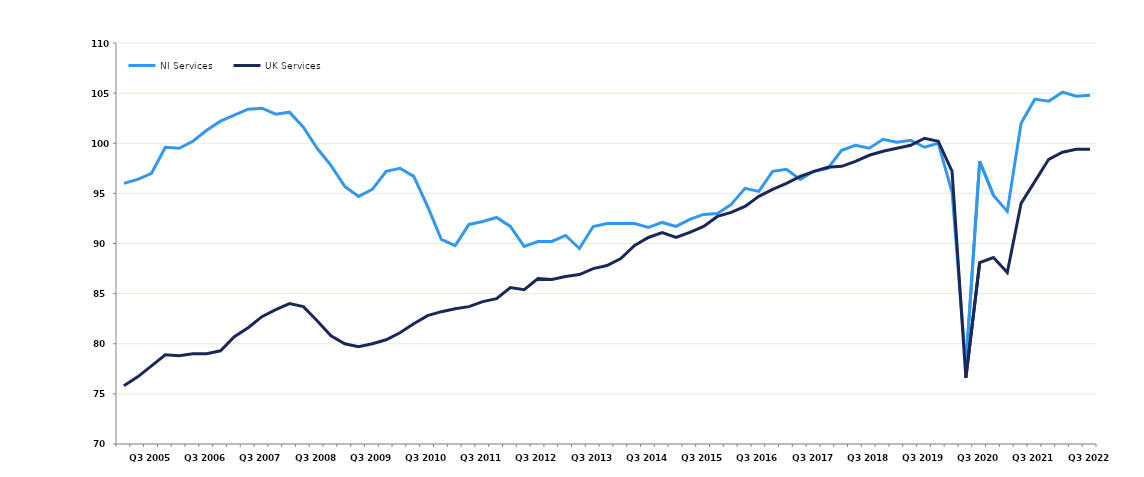
| Category | NI Services | UK Services |
|---|---|---|
|  | 96 | 75.8 |
|  | 96.4 | 76.7 |
| Q3 2005 | 97 | 77.8 |
|  | 99.6 | 78.9 |
|  | 99.5 | 78.8 |
|  | 100.2 | 79 |
| Q3 2006 | 101.3 | 79 |
|  | 102.2 | 79.3 |
|  | 102.8 | 80.7 |
|  | 103.4 | 81.6 |
| Q3 2007 | 103.5 | 82.7 |
|  | 102.9 | 83.4 |
|  | 103.1 | 84 |
|  | 101.6 | 83.7 |
| Q3 2008 | 99.5 | 82.3 |
|  | 97.8 | 80.8 |
|  | 95.7 | 80 |
|  | 94.7 | 79.7 |
| Q3 2009 | 95.4 | 80 |
|  | 97.2 | 80.4 |
|  | 97.5 | 81.1 |
|  | 96.7 | 82 |
| Q3 2010 | 93.7 | 82.8 |
|  | 90.4 | 83.2 |
|  | 89.8 | 83.5 |
|  | 91.9 | 83.7 |
| Q3 2011 | 92.2 | 84.2 |
|  | 92.6 | 84.5 |
|  | 91.7 | 85.6 |
|  | 89.7 | 85.4 |
| Q3 2012 | 90.2 | 86.5 |
|  | 90.2 | 86.4 |
|  | 90.8 | 86.7 |
|  | 89.5 | 86.9 |
| Q3 2013 | 91.7 | 87.5 |
|  | 92 | 87.8 |
|  | 92 | 88.5 |
|  | 92 | 89.8 |
| Q3 2014 | 91.6 | 90.6 |
|  | 92.1 | 91.1 |
|  | 91.7 | 90.6 |
|  | 92.4 | 91.1 |
| Q3 2015 | 92.9 | 91.7 |
|  | 93 | 92.7 |
|  | 93.9 | 93.1 |
|  | 95.5 | 93.7 |
| Q3 2016 | 95.2 | 94.7 |
|  | 97.2 | 95.4 |
|  | 97.4 | 96 |
|  | 96.4 | 96.7 |
| Q3 2017 | 97.2 | 97.2 |
|  | 97.5 | 97.6 |
|  | 99.3 | 97.7 |
|  | 99.8 | 98.2 |
| Q3 2018 | 99.5 | 98.8 |
|  | 100.4 | 99.2 |
|  | 100.1 | 99.5 |
|  | 100.3 | 99.8 |
| Q3 2019 | 99.6 | 100.5 |
|  | 100 | 100.2 |
|  | 95.1 | 97.2 |
|  | 77.8 | 76.6 |
| Q3 2020 | 98.2 | 88.1 |
|  | 94.8 | 88.6 |
|  | 93.2 | 87.1 |
|  | 102 | 94 |
| Q3 2021 | 104.4 | 96.2 |
|  | 104.2 | 98.4 |
|  | 105.1 | 99.1 |
|  | 104.7 | 99.4 |
| Q3 2022 | 104.8 | 99.4 |